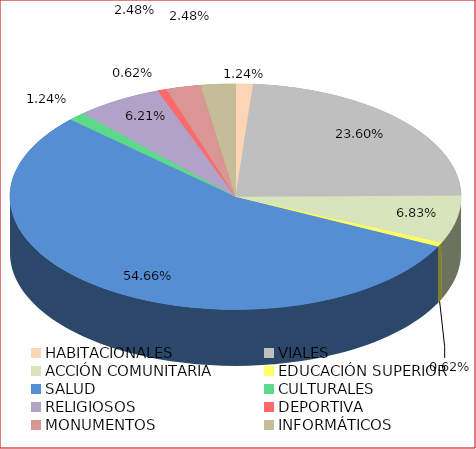
| Category | EJECUTORIAS 2017 POR LÍNEA DE ACCIÓN |
|---|---|
| HABITACIONALES | 0.012 |
| VIALES | 0.236 |
| ACCIÓN COMUNITARIA | 0.068 |
| EDUCACIÓN SUPERIOR | 0.006 |
| SALUD | 0.547 |
| CULTURALES | 0.012 |
| RELIGIOSOS | 0.062 |
| DEPORTIVA | 0.006 |
| MONUMENTOS | 0.025 |
| INFORMÁTICOS | 0.025 |